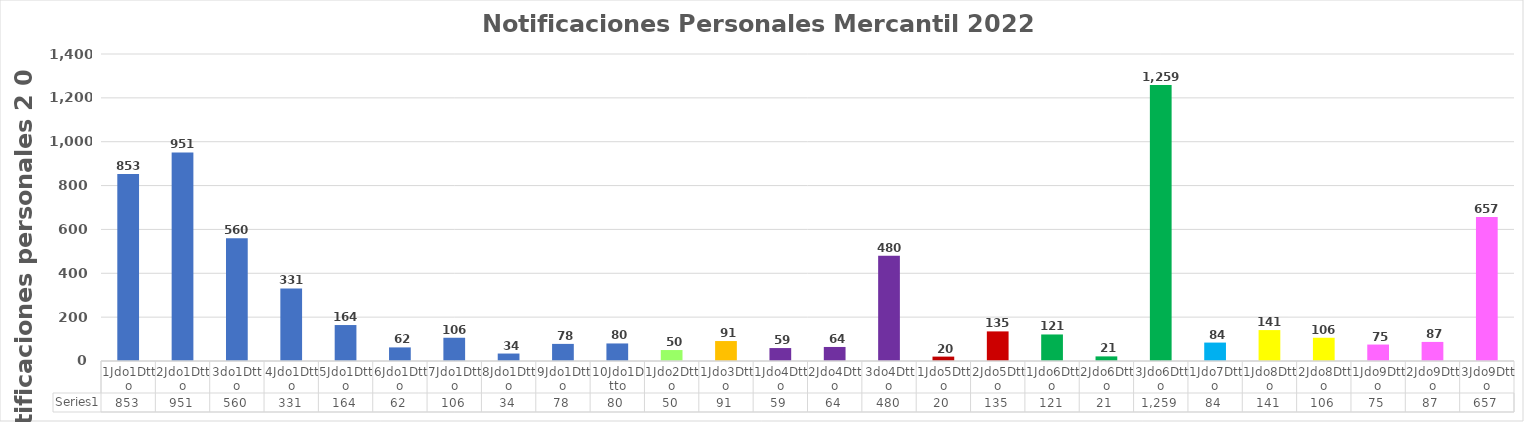
| Category | Series 0 |
|---|---|
| 1Jdo1Dtto | 853 |
| 2Jdo1Dtto | 951 |
| 3do1Dtto | 560 |
| 4Jdo1Dtto | 331 |
| 5Jdo1Dtto | 164 |
| 6Jdo1Dtto | 62 |
| 7Jdo1Dtto | 106 |
| 8Jdo1Dtto | 34 |
| 9Jdo1Dtto | 78 |
| 10Jdo1Dtto | 80 |
| 1Jdo2Dtto | 50 |
| 1Jdo3Dtto | 91 |
| 1Jdo4Dtto | 59 |
| 2Jdo4Dtto | 64 |
| 3do4Dtto | 480 |
| 1Jdo5Dtto | 20 |
| 2Jdo5Dtto | 135 |
| 1Jdo6Dtto | 121 |
| 2Jdo6Dtto | 21 |
| 3Jdo6Dtto | 1259 |
| 1Jdo7Dtto | 84 |
| 1Jdo8Dtto | 141 |
| 2Jdo8Dtto | 106 |
| 1Jdo9Dtto | 75 |
| 2Jdo9Dtto | 87 |
| 3Jdo9Dtto | 657 |